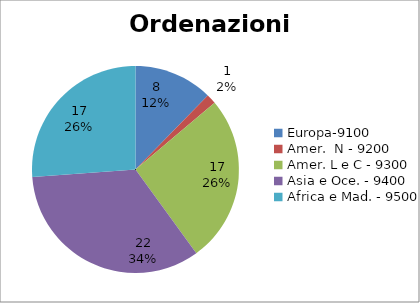
| Category | Series 0 |
|---|---|
| Europa-9100 | 8 |
| Amer.  N - 9200 | 1 |
| Amer. L e C - 9300 | 17 |
| Asia e Oce. - 9400 | 22 |
| Africa e Mad. - 9500 | 17 |